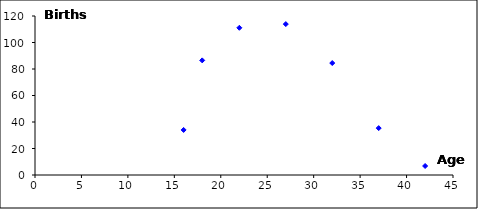
| Category | Series 0 |
|---|---|
| 16.0 | 34 |
| 18.0 | 86.5 |
| 22.0 | 111.1 |
| 27.0 | 113.9 |
| 32.0 | 84.5 |
| 37.0 | 35.4 |
| 42.0 | 6.8 |